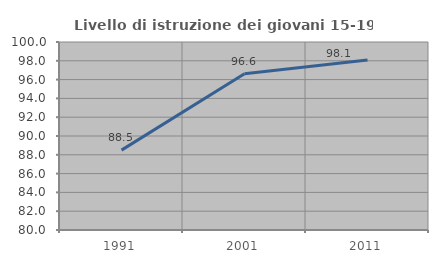
| Category | Livello di istruzione dei giovani 15-19 anni |
|---|---|
| 1991.0 | 88.498 |
| 2001.0 | 96.618 |
| 2011.0 | 98.077 |